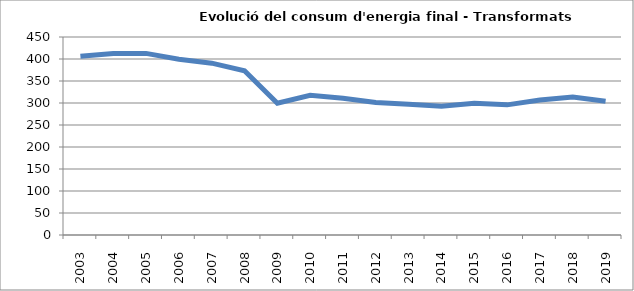
| Category | 406,1 |
|---|---|
| 2003.0 | 406.05 |
| 2004.0 | 412.46 |
| 2005.0 | 412.78 |
| 2006.0 | 399.38 |
| 2007.0 | 390.5 |
| 2008.0 | 373.34 |
| 2009.0 | 299.39 |
| 2010.0 | 317.65 |
| 2011.0 | 310.62 |
| 2012.0 | 301.33 |
| 2013.0 | 296.91 |
| 2014.0 | 292.47 |
| 2015.0 | 299.41 |
| 2016.0 | 295.79 |
| 2017.0 | 306.79 |
| 2018.0 | 313.53 |
| 2019.0 | 304.06 |